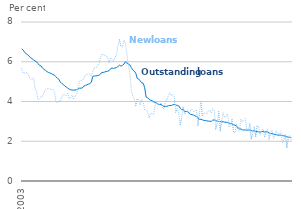
| Category | Outstanding loans | New loans |
|---|---|---|
| 2003-01-01 | 6.649 | 5.652 |
| 2003-02-01 | 6.585 | 5.428 |
| 2003-03-01 | 6.468 | 5.429 |
| 2003-04-01 | 6.404 | 5.454 |
| 2003-05-01 | 6.354 | 5.433 |
| 2003-06-01 | 6.27 | 5.239 |
| 2003-07-01 | 6.201 | 5.121 |
| 2003-08-01 | 6.157 | 5.18 |
| 2003-09-01 | 6.096 | 5.147 |
| 2003-10-01 | 6.039 | 4.662 |
| 2003-11-01 | 5.996 | 4.503 |
| 2003-12-01 | 5.91 | 4.099 |
| 2004-01-01 | 5.817 | 4.172 |
| 2004-02-01 | 5.792 | 4.236 |
| 2004-03-01 | 5.68 | 4.249 |
| 2004-04-01 | 5.62 | 4.436 |
| 2004-05-01 | 5.57 | 4.608 |
| 2004-06-01 | 5.505 | 4.622 |
| 2004-07-01 | 5.463 | 4.669 |
| 2004-08-01 | 5.436 | 4.623 |
| 2004-09-01 | 5.405 | 4.618 |
| 2004-10-01 | 5.366 | 4.612 |
| 2004-11-01 | 5.332 | 4.533 |
| 2004-12-01 | 5.25 | 4.043 |
| 2005-01-01 | 5.173 | 3.933 |
| 2005-02-01 | 5.122 | 4.039 |
| 2005-03-01 | 4.984 | 3.987 |
| 2005-04-01 | 4.907 | 4.218 |
| 2005-05-01 | 4.861 | 4.367 |
| 2005-06-01 | 4.783 | 4.329 |
| 2005-07-01 | 4.73 | 4.313 |
| 2005-08-01 | 4.677 | 4.438 |
| 2005-09-01 | 4.624 | 4.115 |
| 2005-10-01 | 4.59 | 4.202 |
| 2005-11-01 | 4.579 | 4.315 |
| 2005-12-01 | 4.573 | 4.101 |
| 2006-01-01 | 4.581 | 4.288 |
| 2006-02-01 | 4.59 | 4.35 |
| 2006-03-01 | 4.627 | 4.693 |
| 2006-04-01 | 4.671 | 4.996 |
| 2006-05-01 | 4.67 | 5.056 |
| 2006-06-01 | 4.688 | 5.066 |
| 2006-07-01 | 4.776 | 5.184 |
| 2006-08-01 | 4.808 | 5.329 |
| 2006-09-01 | 4.836 | 5.346 |
| 2006-10-01 | 4.875 | 5.381 |
| 2006-11-01 | 4.896 | 5.376 |
| 2006-12-01 | 4.98 | 5.261 |
| 2007-01-01 | 5.264 | 5.512 |
| 2007-02-01 | 5.285 | 5.692 |
| 2007-03-01 | 5.286 | 5.674 |
| 2007-04-01 | 5.306 | 5.763 |
| 2007-05-01 | 5.314 | 5.882 |
| 2007-06-01 | 5.363 | 6.18 |
| 2007-07-01 | 5.463 | 6.378 |
| 2007-08-01 | 5.463 | 6.354 |
| 2007-09-01 | 5.483 | 6.321 |
| 2007-10-01 | 5.513 | 6.307 |
| 2007-11-01 | 5.523 | 6.193 |
| 2007-12-01 | 5.555 | 5.929 |
| 2008-01-01 | 5.649 | 6.212 |
| 2008-02-01 | 5.689 | 6.101 |
| 2008-03-01 | 5.66 | 6.055 |
| 2008-04-01 | 5.691 | 6.209 |
| 2008-05-01 | 5.712 | 6.383 |
| 2008-06-01 | 5.762 | 6.826 |
| 2008-07-01 | 5.832 | 7.103 |
| 2008-08-01 | 5.78 | 6.771 |
| 2008-09-01 | 5.817 | 6.738 |
| 2008-10-01 | 5.879 | 7.099 |
| 2008-11-01 | 5.998 | 6.918 |
| 2008-12-01 | 5.936 | 6.396 |
| 2009-01-01 | 5.889 | 5.797 |
| 2009-02-01 | 5.839 | 5.395 |
| 2009-03-01 | 5.705 | 4.574 |
| 2009-04-01 | 5.594 | 4.266 |
| 2009-05-01 | 5.532 | 4.148 |
| 2009-06-01 | 5.42 | 3.798 |
| 2009-07-01 | 5.166 | 4.113 |
| 2009-08-01 | 5.128 | 4.089 |
| 2009-09-01 | 5.037 | 3.825 |
| 2009-10-01 | 4.941 | 4.115 |
| 2009-11-01 | 4.92 | 3.969 |
| 2009-12-01 | 4.707 | 3.577 |
| 2010-01-01 | 4.223 | 3.548 |
| 2010-02-01 | 4.187 | 3.477 |
| 2010-03-01 | 4.105 | 3.168 |
| 2010-04-01 | 4.068 | 3.409 |
| 2010-05-01 | 4.045 | 3.384 |
| 2010-06-01 | 3.987 | 3.326 |
| 2010-07-01 | 3.947 | 3.793 |
| 2010-08-01 | 3.929 | 3.924 |
| 2010-09-01 | 3.865 | 3.825 |
| 2010-10-01 | 3.846 | 3.856 |
| 2010-11-01 | 3.849 | 3.932 |
| 2010-12-01 | 3.802 | 3.668 |
| 2011-01-01 | 3.751 | 3.629 |
| 2011-02-01 | 3.754 | 4.049 |
| 2011-03-01 | 3.758 | 4.077 |
| 2011-04-01 | 3.786 | 4.303 |
| 2011-05-01 | 3.798 | 4.446 |
| 2011-06-01 | 3.8 | 4.291 |
| 2011-07-01 | 3.832 | 4.353 |
| 2011-08-01 | 3.852 | 4.236 |
| 2011-09-01 | 3.833 | 3.467 |
| 2011-10-01 | 3.795 | 3.65 |
| 2011-11-01 | 3.781 | 3.42 |
| 2011-12-01 | 3.666 | 2.827 |
| 2012-01-01 | 3.593 | 3.199 |
| 2012-02-01 | 3.608 | 3.716 |
| 2012-03-01 | 3.497 | 3.379 |
| 2012-04-01 | 3.498 | 3.443 |
| 2012-05-01 | 3.484 | 3.577 |
| 2012-06-01 | 3.423 | 3.367 |
| 2012-07-01 | 3.348 | 3.563 |
| 2012-08-01 | 3.341 | 3.59 |
| 2012-09-01 | 3.314 | 3.495 |
| 2012-10-01 | 3.27 | 3.512 |
| 2012-11-01 | 3.264 | 3.563 |
| 2012-12-01 | 3.182 | 2.808 |
| 2013-01-01 | 3.091 | 3.405 |
| 2013-02-01 | 3.11 | 4.002 |
| 2013-03-01 | 3.076 | 3.293 |
| 2013-04-01 | 3.051 | 3.42 |
| 2013-05-01 | 3.043 | 3.408 |
| 2013-06-01 | 3.025 | 3.384 |
| 2013-07-01 | 3.015 | 3.537 |
| 2013-08-01 | 3.008 | 3.552 |
| 2013-09-01 | 2.997 | 3.434 |
| 2013-10-01 | 3.066 | 3.636 |
| 2013-11-01 | 3.07 | 3.566 |
| 2013-12-01 | 3.047 | 2.616 |
| 2014-01-01 | 3.004 | 2.895 |
| 2014-02-01 | 2.999 | 3.495 |
| 2014-03-01 | 2.991 | 2.519 |
| 2014-04-01 | 2.981 | 3.061 |
| 2014-05-01 | 2.98 | 3.424 |
| 2014-06-01 | 2.965 | 3.202 |
| 2014-07-01 | 2.956 | 3.254 |
| 2014-08-01 | 2.944 | 3.383 |
| 2014-09-01 | 2.915 | 2.697 |
| 2014-10-01 | 2.892 | 2.805 |
| 2014-11-01 | 2.88 | 3.098 |
| 2014-12-01 | 2.828 | 2.446 |
| 2015-01-01 | 2.808 | 2.42 |
| 2015-02-01 | 2.751 | 2.833 |
| 2015-03-01 | 2.695 | 2.58 |
| 2015-04-01 | 2.621 | 2.531 |
| 2015-05-01 | 2.62 | 3.117 |
| 2015-06-01 | 2.572 | 2.98 |
| 2015-07-01 | 2.567 | 3.042 |
| 2015-08-01 | 2.566 | 3.147 |
| 2015-09-01 | 2.561 | 2.572 |
| 2015-10-01 | 2.56 | 2.578 |
| 2015-11-01 | 2.563 | 2.867 |
| 2015-12-01 | 2.538 | 2.126 |
| 2016-01-01 | 2.512 | 2.38 |
| 2016-02-01 | 2.529 | 2.706 |
| 2016-03-01 | 2.496 | 2.246 |
| 2016-04-01 | 2.481 | 2.799 |
| 2016-05-01 | 2.476 | 2.733 |
| 2016-06-01 | 2.459 | 2.302 |
| 2016-07-01 | 2.496 | 2.49 |
| 2016-08-01 | 2.486 | 2.619 |
| 2016-09-01 | 2.466 | 2.23 |
| 2016-10-01 | 2.479 | 2.451 |
| 2016-11-01 | 2.468 | 2.604 |
| 2016-12-01 | 2.414 | 2.106 |
| 2017-01-01 | 2.389 | 2.439 |
| 2017-02-01 | 2.38 | 2.552 |
| 2017-03-01 | 2.366 | 2.129 |
| 2017-04-01 | 2.333 | 2.306 |
| 2017-05-01 | 2.328 | 2.525 |
| 2017-06-01 | 2.309 | 2.289 |
| 2017-07-01 | 2.307 | 2.415 |
| 2017-08-01 | 2.305 | 2.482 |
| 2017-09-01 | 2.286 | 1.918 |
| 2017-10-01 | 2.269 | 2.086 |
| 2017-11-01 | 2.261 | 2.313 |
| 2017-12-01 | 2.223 | 1.705 |
| 2018-01-01 | 2.205 | 2.154 |
| 2018-02-01 | 2.201 | 2.278 |
| 2018-03-01 | 2.189 | 2.049 |